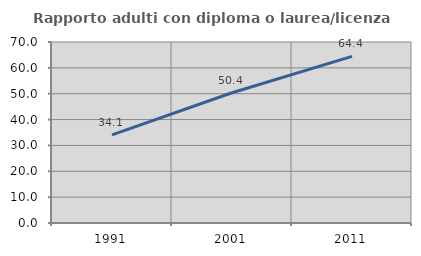
| Category | Rapporto adulti con diploma o laurea/licenza media  |
|---|---|
| 1991.0 | 34.109 |
| 2001.0 | 50.363 |
| 2011.0 | 64.44 |